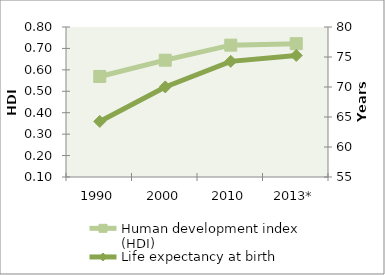
| Category | Human development index (HDI) |
|---|---|
| 1990 | 0.569 |
| 2000 | 0.645 |
| 2010 | 0.715 |
| 2013* | 0.722 |